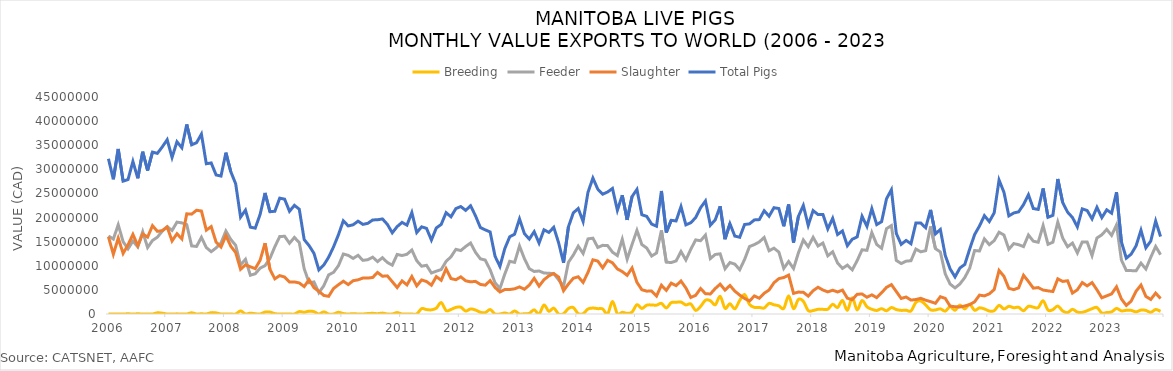
| Category | Breeding | Feeder | Slaughter | Total Pigs |
|---|---|---|---|---|
| 2006-01-01 | 0 | 16188880 | 16004471 | 32193351 |
| 2006-02-01 | 0 | 15535831 | 12390998 | 27926829 |
| 2006-03-01 | 0 | 18503718 | 15731492 | 34235210 |
| 2006-04-01 | 0 | 14990701 | 12563268 | 27553969 |
| 2006-05-01 | 38000 | 13508655 | 14342720 | 27889375 |
| 2006-06-01 | 0 | 15119292 | 16507490 | 31626782 |
| 2006-07-01 | 37093 | 13923157 | 14180102 | 28140352 |
| 2006-08-01 | 0 | 17060672 | 16595760 | 33656432 |
| 2006-09-01 | 22132 | 13789375 | 15944231 | 29755738 |
| 2006-10-01 | 0 | 15249140 | 18317220 | 33566360 |
| 2006-11-01 | 241380 | 15932440 | 17140122 | 33313942 |
| 2006-12-01 | 166150 | 17185610 | 17301057 | 34652817 |
| 2007-01-01 | 0 | 18110266 | 18032806 | 36143072 |
| 2007-02-01 | 0 | 17320524 | 15146810 | 32467334 |
| 2007-03-01 | 27467 | 19047457 | 16646885 | 35721809 |
| 2007-04-01 | 0 | 18898695 | 15573850 | 34472545 |
| 2007-05-01 | 0 | 18541027 | 20773734 | 39314761 |
| 2007-06-01 | 251147 | 14121701 | 20708692 | 35081540 |
| 2007-07-01 | 0 | 14006352 | 21515045 | 35521397 |
| 2007-08-01 | 44349 | 15898758 | 21357817 | 37300924 |
| 2007-09-01 | 0 | 13775827 | 17387786 | 31163613 |
| 2007-10-01 | 274288 | 12926434 | 18122063 | 31322785 |
| 2007-11-01 | 224016 | 13703922 | 14905006 | 28832944 |
| 2007-12-01 | 0 | 14729118 | 13876955 | 28606073 |
| 2008-01-01 | 0 | 17206036 | 16254609 | 33460645 |
| 2008-02-01 | 0 | 15457358 | 14058203 | 29515561 |
| 2008-03-01 | 0 | 14250245 | 12749126 | 26999371 |
| 2008-04-01 | 631761 | 10183388 | 9268881 | 20084030 |
| 2008-05-01 | 7075 | 11339242 | 10194082 | 21540399 |
| 2008-06-01 | 176451 | 8037021 | 9790925 | 18004397 |
| 2008-07-01 | 53919 | 8346137 | 9406808 | 17806864 |
| 2008-08-01 | 7654 | 9504222 | 11158534 | 20670410 |
| 2008-09-01 | 395637 | 10021778 | 14691450 | 25108865 |
| 2008-10-01 | 397276 | 11531661 | 9281819 | 21210756 |
| 2008-11-01 | 71881 | 13945399 | 7290921 | 21308201 |
| 2008-12-01 | 0 | 16063457 | 7962057 | 24025514 |
| 2009-01-01 | 24518 | 16118038 | 7671284 | 23813840 |
| 2009-02-01 | 0 | 14666830 | 6631607 | 21298437 |
| 2009-03-01 | 0 | 15879882 | 6654040 | 22533922 |
| 2009-04-01 | 493117 | 14798862 | 6435177 | 21727156 |
| 2009-05-01 | 357966 | 9384660 | 5684892 | 15427518 |
| 2009-06-01 | 584160 | 6487528 | 7113838 | 14185526 |
| 2009-07-01 | 481047 | 6647779 | 5446693 | 12575519 |
| 2009-08-01 | 0 | 4414247 | 4728180 | 9142427 |
| 2009-09-01 | 441088 | 5848015 | 3851702 | 10140805 |
| 2009-10-01 | 0 | 8120211 | 3663137 | 11783348 |
| 2009-11-01 | 0 | 8638452 | 5284166 | 13922618 |
| 2009-12-01 | 350927 | 10018479 | 6068207 | 16437613 |
| 2010-01-01 | 93839 | 12441666 | 6796801 | 19332306 |
| 2010-02-01 | 0 | 12161034 | 6102393 | 18263427 |
| 2010-03-01 | 69922 | 11529198 | 6900117 | 18499237 |
| 2010-04-01 | 0 | 12163467 | 7083242 | 19246709 |
| 2010-05-01 | 0 | 11127958 | 7459726 | 18587684 |
| 2010-06-01 | 95571 | 11257605 | 7446365 | 18799541 |
| 2010-07-01 | 135453 | 11788124 | 7579344 | 19502921 |
| 2010-08-01 | 66794 | 10867870 | 8609052 | 19543716 |
| 2010-09-01 | 186442 | 11688542 | 7835551 | 19710535 |
| 2010-10-01 | 0 | 10681617 | 7903227 | 18584844 |
| 2010-11-01 | 0 | 10129070 | 6705835 | 16834905 |
| 2010-12-01 | 293935 | 12350508 | 5481114 | 18125557 |
| 2011-01-01 | 0 | 12123108 | 6869612 | 18992720 |
| 2011-02-01 | 0 | 12388890 | 6037583 | 18426473 |
| 2011-03-01 | 0 | 13271229 | 7774785 | 21046014 |
| 2011-04-01 | 0 | 11049901 | 5840948 | 16890849 |
| 2011-05-01 | 1112792 | 9905353 | 7058476 | 18076621 |
| 2011-06-01 | 913242 | 10102572 | 6741145 | 17756959 |
| 2011-07-01 | 862957 | 8502900 | 5969867 | 15335724 |
| 2011-08-01 | 1210233 | 8877760 | 7756375 | 17844368 |
| 2011-09-01 | 2366205 | 9214002 | 6996530 | 18576737 |
| 2011-10-01 | 707523 | 10917333 | 9388252 | 21013108 |
| 2011-11-01 | 943183 | 11863649 | 7350102 | 20156934 |
| 2011-12-01 | 1359343 | 13405966 | 7101983 | 21867292 |
| 2012-01-01 | 1421392 | 13154553 | 7703763 | 22279708 |
| 2012-02-01 | 604763 | 13998704 | 6891844 | 21495311 |
| 2012-03-01 | 1056736 | 14720938 | 6663634 | 22441308 |
| 2012-04-01 | 824206 | 12797221 | 6764043 | 20385470 |
| 2012-05-01 | 361425 | 11439605 | 6135033 | 17936063 |
| 2012-06-01 | 282492 | 11185147 | 5979537 | 17447176 |
| 2012-07-01 | 926210 | 9171554 | 6918489 | 17016253 |
| 2012-08-01 | 0 | 6483314 | 5493441 | 11976755 |
| 2012-09-01 | 0 | 5299984 | 4569701 | 9869685 |
| 2012-10-01 | 207604 | 8295268 | 5075747 | 13578619 |
| 2012-11-01 | 0 | 10932649 | 5081658 | 16014307 |
| 2012-12-01 | 624958 | 10704609 | 5219504 | 16549071 |
| 2013-01-01 | 0 | 14100295 | 5617862 | 19718157 |
| 2013-02-01 | 57998 | 11484809 | 5127992 | 16670799 |
| 2013-03-01 | 144686 | 9399460 | 5990809 | 15534955 |
| 2013-04-01 | 863662 | 8818852 | 7392718 | 17075232 |
| 2013-05-01 | 0 | 8922987 | 5787087 | 14710074 |
| 2013-06-01 | 1863105 | 8499034 | 7101280 | 17463419 |
| 2013-07-01 | 559762 | 8451768 | 7917136 | 16928666 |
| 2013-08-01 | 1227687 | 8365006 | 8384063 | 17976756 |
| 2013-09-01 | 0 | 7087654 | 7655048 | 14742702 |
| 2013-10-01 | 67181 | 5729395 | 4823028 | 10619604 |
| 2013-11-01 | 1139737 | 10732043 | 6216014 | 18087794 |
| 2013-12-01 | 1332999 | 12232206 | 7417123 | 20982328 |
| 2014-01-01 | 84774 | 14070240 | 7719661 | 21874675 |
| 2014-02-01 | 78300 | 12542484 | 6553441 | 19174225 |
| 2014-03-01 | 1041676 | 15577218 | 8638979 | 25257873 |
| 2014-04-01 | 1229567 | 15723323 | 11237873 | 28190763 |
| 2014-05-01 | 1112351 | 13802577 | 10971128 | 25886056 |
| 2014-06-01 | 1042464 | 14238914 | 9564808 | 24846186 |
| 2014-07-01 | 0 | 14187120 | 11116386 | 25303506 |
| 2014-08-01 | 2600177 | 12824696 | 10609697 | 26034570 |
| 2014-09-01 | 49676 | 12115168 | 9346570 | 21511414 |
| 2014-10-01 | 346700 | 15488731 | 8792893 | 24628324 |
| 2014-11-01 | 129352 | 11372934 | 8011618 | 19513904 |
| 2014-12-01 | 390878 | 14417927 | 9546994 | 24355799 |
| 2015-01-01 | 1928863 | 17340020 | 6567036 | 25835919 |
| 2015-02-01 | 1149971 | 14401536 | 5027710 | 20579217 |
| 2015-03-01 | 1827896 | 13677602 | 4741679 | 20247177 |
| 2015-04-01 | 1880067 | 12021510 | 4749869 | 18651446 |
| 2015-05-01 | 1834106 | 12647097 | 3724731 | 18205934 |
| 2015-06-01 | 2205807 | 17338573 | 5959970 | 25504350 |
| 2015-07-01 | 1254780 | 10751914 | 4899615 | 16906309 |
| 2015-08-01 | 2354015 | 10665479 | 6406786 | 19426280 |
| 2015-09-01 | 2426022 | 10997353 | 5878053 | 19301428 |
| 2015-10-01 | 2476149 | 12960637 | 6832947 | 22269733 |
| 2015-11-01 | 1884401 | 11206546 | 5395306 | 18486253 |
| 2015-12-01 | 2083841 | 13412949 | 3428065 | 18924855 |
| 2016-01-01 | 751335 | 15366418 | 3870778 | 19988531 |
| 2016-02-01 | 1558169 | 15191678 | 5276329 | 22026176 |
| 2016-03-01 | 2854836 | 16365841 | 4219275 | 23439952 |
| 2016-04-01 | 2763206 | 11493642 | 4150977 | 18407825 |
| 2016-05-01 | 1902341 | 12343958 | 5278658 | 19524957 |
| 2016-06-01 | 3666317 | 12473370 | 6190399 | 22330086 |
| 2016-07-01 | 1186294 | 9376274 | 4958169 | 15520737 |
| 2016-08-01 | 2139916 | 10672862 | 5912745 | 18725523 |
| 2016-09-01 | 1069724 | 10344036 | 4746815 | 16160575 |
| 2016-10-01 | 2808407 | 9186764 | 3916038 | 15911209 |
| 2016-11-01 | 4026404 | 11315878 | 3220365 | 18562647 |
| 2016-12-01 | 1989073 | 13992877 | 2707717 | 18689667 |
| 2017-01-01 | 1373724 | 14394516 | 3744344 | 19512584 |
| 2017-02-01 | 1362559 | 14942406 | 3270953 | 19575918 |
| 2017-03-01 | 1243490 | 15870408 | 4299081 | 21412979 |
| 2017-04-01 | 2192885 | 13110764 | 4981544 | 20285193 |
| 2017-05-01 | 1914046 | 13652218 | 6476679 | 22042943 |
| 2017-06-01 | 1691012 | 12839791 | 7335977 | 21866780 |
| 2017-07-01 | 1167591 | 9453457 | 7565631 | 18186679 |
| 2017-08-01 | 3758303 | 10888645 | 8072074 | 22719022 |
| 2017-09-01 | 1102468 | 9434390 | 4276712 | 14813570 |
| 2017-10-01 | 3020597 | 12686186 | 4544674 | 20251457 |
| 2017-11-01 | 2647062 | 15351605 | 4508997 | 22507664 |
| 2017-12-01 | 705431 | 13962593 | 3711086 | 18379110 |
| 2018-01-01 | 717345 | 15895321 | 4833120 | 21445786 |
| 2018-02-01 | 974447 | 14103238 | 5546717 | 20624402 |
| 2018-03-01 | 961543 | 14714563 | 4973558 | 20649664 |
| 2018-04-01 | 988795 | 12066737 | 4584834 | 17640366 |
| 2018-05-01 | 2013086 | 12902623 | 4927509 | 19843218 |
| 2018-06-01 | 1338276 | 10571113 | 4571617 | 16481006 |
| 2018-07-01 | 2809004 | 9460205 | 4954854 | 17224063 |
| 2018-08-01 | 759613 | 10137402 | 3275244 | 14172259 |
| 2018-09-01 | 3373651 | 9153803 | 2976585 | 15504039 |
| 2018-10-01 | 844363 | 11060778 | 4083670 | 15988811 |
| 2018-11-01 | 2794399 | 13311895 | 4156111 | 20262405 |
| 2018-12-01 | 1492531 | 13206577 | 3477213 | 18176321 |
| 2019-01-01 | 983170 | 16884439 | 3970057 | 21837666 |
| 2019-02-01 | 732563 | 14414774 | 3392320 | 18539657 |
| 2019-03-01 | 1109151 | 13627918 | 4413044 | 19150113 |
| 2019-04-01 | 677644 | 17696185 | 5531226 | 23905055 |
| 2019-05-01 | 1340831 | 18339397 | 6088284 | 25768512 |
| 2019-06-01 | 924803 | 11112421 | 4663708 | 16700932 |
| 2019-07-01 | 751429 | 10465696 | 3225290 | 14442415 |
| 2019-08-01 | 782043 | 10951963 | 3518430 | 15252436 |
| 2019-09-01 | 633298 | 11055820 | 2882276 | 14571394 |
| 2019-10-01 | 2399862 | 13461468 | 3001638 | 18862968 |
| 2019-11-01 | 2700012 | 12897292 | 3251934 | 18849238 |
| 2019-12-01 | 1886432 | 13134124 | 2861793 | 17882349 |
| 2020-01-01 | 865422 | 18160251 | 2564526 | 21590199 |
| 2020-02-01 | 840624 | 13545818 | 2223558 | 16610000 |
| 2020-03-01 | 1068716 | 12875257 | 3587523 | 17531496 |
| 2020-04-01 | 598327 | 8315744 | 3241489 | 12155560 |
| 2020-05-01 | 1516661 | 6208267 | 1627573 | 9352501 |
| 2020-06-01 | 775186 | 5410928 | 1509698 | 7695812 |
| 2020-07-01 | 1853494 | 6225932 | 1462757 | 9542183 |
| 2020-08-01 | 1050391 | 7573568 | 1664927 | 10288886 |
| 2020-09-01 | 2015633 | 9508257 | 1955810 | 13479700 |
| 2020-10-01 | 779065 | 13165028 | 2525048 | 16469141 |
| 2020-11-01 | 1270703 | 13064755 | 3915472 | 18250930 |
| 2020-12-01 | 1054987 | 15578473 | 3755724 | 20389184 |
| 2021-01-01 | 616172 | 14378960 | 4176827 | 19171959 |
| 2021-02-01 | 689083 | 15210433 | 5059825 | 20959341 |
| 2021-03-01 | 1793813 | 16956738 | 9031200 | 27781751 |
| 2021-04-01 | 1046012 | 16381062 | 7807134 | 25234208 |
| 2021-05-01 | 1591707 | 13437555 | 5315704 | 20344966 |
| 2021-06-01 | 1301414 | 14596494 | 5055095 | 20953003 |
| 2021-07-01 | 1388410 | 14375164 | 5419512 | 21183086 |
| 2021-08-01 | 678991 | 13981255 | 8026668 | 22686914 |
| 2021-09-01 | 1605832 | 16381271 | 6745658 | 24732761 |
| 2021-10-01 | 1411582 | 15100133 | 5360229 | 21871944 |
| 2021-11-01 | 1333105 | 14875755 | 5476018 | 21684878 |
| 2021-12-01 | 2745333 | 18329453 | 4963625 | 26038411 |
| 2022-01-01 | 808014 | 14448871 | 4798530 | 20055415 |
| 2022-02-01 | 907260 | 14892983 | 4662870 | 20463113 |
| 2022-03-01 | 1651464 | 19057800 | 7288530 | 27997794 |
| 2022-04-01 | 634945 | 15747256 | 6752781 | 23134982 |
| 2022-05-01 | 285544 | 13945960 | 6890580 | 21122084 |
| 2022-06-01 | 966736 | 14705779 | 4335938 | 20008453 |
| 2022-07-01 | 388725 | 12655669 | 5023941 | 18068335 |
| 2022-08-01 | 337067 | 14952664 | 6516346 | 21806077 |
| 2022-09-01 | 679988 | 14942453 | 5831663 | 21454104 |
| 2022-10-01 | 1103912 | 12109189 | 6512601 | 19725702 |
| 2022-11-01 | 1350907 | 15758009 | 5017401 | 22126317 |
| 2022-12-01 | 206054 | 16423252 | 3357955 | 19987261 |
| 2023-01-01 | 295720 | 17544393 | 3764118 | 21604231 |
| 2023-02-01 | 439082 | 16295169 | 4173074 | 20907325 |
| 2023-03-01 | 1155512 | 18468631 | 5630902 | 25255045 |
| 2023-04-01 | 649642 | 11197991 | 3115683 | 14963316 |
| 2023-05-01 | 765332 | 9033619 | 1780716 | 11579667 |
| 2023-06-01 | 751435 | 8999744 | 2670413 | 12421592 |
| 2023-07-01 | 440496 | 8956622 | 4738054 | 14135172 |
| 2023-08-01 | 818982 | 10548100 | 6000920 | 17368002 |
| 2023-09-01 | 745387 | 9327835 | 3648695 | 13721917 |
| 2023-10-01 | 335336 | 11764242 | 3021387 | 15120965 |
| 2023-11-01 | 937869 | 14006945 | 4333767 | 19278581 |
| 2023-12-01 | 551133 | 12301430 | 3208552 | 16061115 |